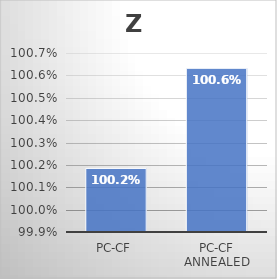
| Category | Z |
|---|---|
| PC-CF | 1.002 |
| PC-CF annealed | 1.006 |